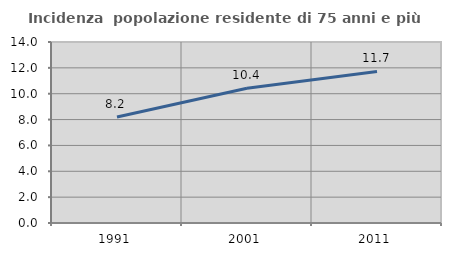
| Category | Incidenza  popolazione residente di 75 anni e più |
|---|---|
| 1991.0 | 8.197 |
| 2001.0 | 10.427 |
| 2011.0 | 11.722 |